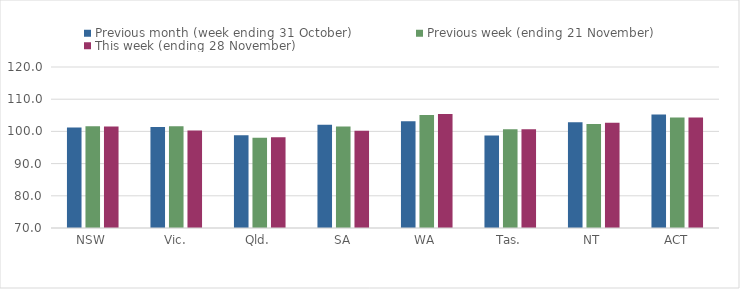
| Category | Previous month (week ending 31 October) | Previous week (ending 21 November) | This week (ending 28 November) |
|---|---|---|---|
| NSW | 101.21 | 101.62 | 101.55 |
| Vic. | 101.36 | 101.62 | 100.25 |
| Qld. | 98.84 | 98.01 | 98.19 |
| SA | 102.08 | 101.55 | 100.22 |
| WA | 103.14 | 105.12 | 105.44 |
| Tas. | 98.72 | 100.67 | 100.64 |
| NT | 102.86 | 102.31 | 102.68 |
| ACT | 105.25 | 104.34 | 104.34 |